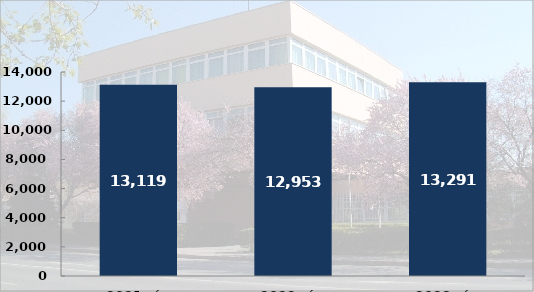
| Category | Rendészeti állomány közterületi szolgálati létszám (fő) |
|---|---|
| 2021. év | 13119 |
| 2022. év | 12953 |
| 2023. év | 13291 |